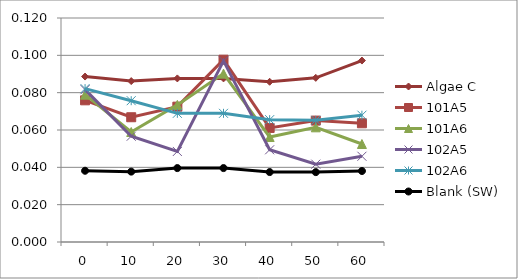
| Category | Algae C | 101A5 | 101A6 | 102A5 | 102A6 | Blank (SW) |
|---|---|---|---|---|---|---|
| 0.0 | 0.089 | 0.076 | 0.079 | 0.082 | 0.082 | 0.038 |
| 10.0 | 0.086 | 0.067 | 0.059 | 0.057 | 0.076 | 0.038 |
| 20.0 | 0.088 | 0.072 | 0.073 | 0.048 | 0.069 | 0.04 |
| 30.0 | 0.088 | 0.098 | 0.09 | 0.097 | 0.069 | 0.04 |
| 40.0 | 0.086 | 0.061 | 0.056 | 0.049 | 0.066 | 0.037 |
| 50.0 | 0.088 | 0.065 | 0.061 | 0.042 | 0.065 | 0.037 |
| 60.0 | 0.097 | 0.064 | 0.052 | 0.046 | 0.068 | 0.038 |